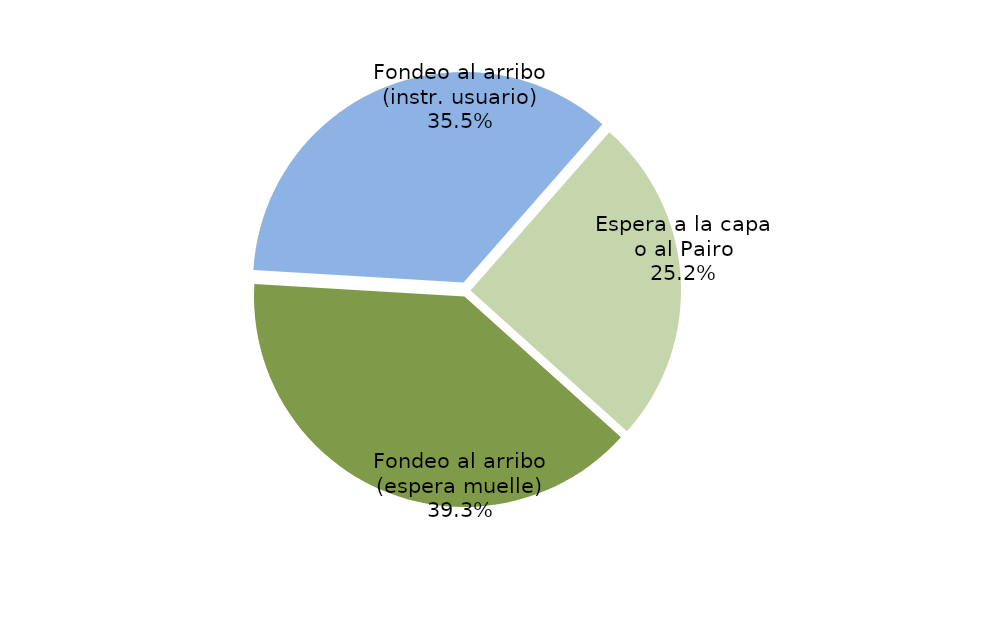
| Category | Series 0 |
|---|---|
| Fondeo al arribo (espera muelle) | 10924.583 |
| Fondeo al arribo (instr. usuario) | 9882.867 |
| Espera a la capa o al Pairo | 7011.667 |